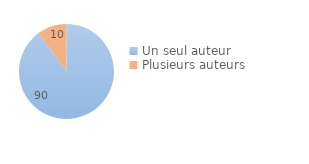
| Category | Series 0 |
|---|---|
| Un seul auteur | 90 |
| Plusieurs auteurs | 10 |